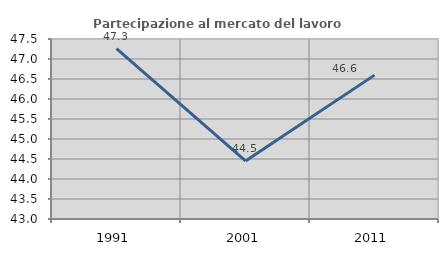
| Category | Partecipazione al mercato del lavoro  femminile |
|---|---|
| 1991.0 | 47.258 |
| 2001.0 | 44.453 |
| 2011.0 | 46.597 |